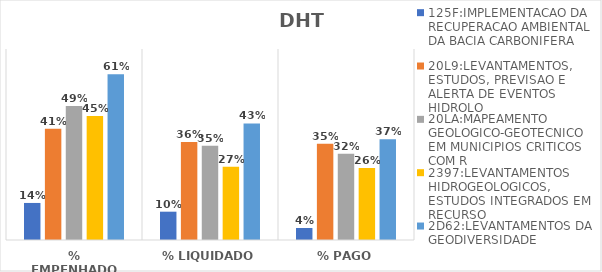
| Category | 125F:IMPLEMENTACAO DA RECUPERACAO AMBIENTAL DA BACIA CARBONIFERA | 20L9:LEVANTAMENTOS, ESTUDOS, PREVISAO E ALERTA DE EVENTOS HIDROLO | 20LA:MAPEAMENTO GEOLOGICO-GEOTECNICO EM MUNICIPIOS CRITICOS COM R | 2397:LEVANTAMENTOS HIDROGEOLOGICOS, ESTUDOS INTEGRADOS EM RECURSO | 2D62:LEVANTAMENTOS DA GEODIVERSIDADE |
|---|---|---|---|---|---|
| % EMPENHADO | 0.136 | 0.408 | 0.491 | 0.454 | 0.607 |
| % LIQUIDADO | 0.104 | 0.359 | 0.345 | 0.268 | 0.427 |
| % PAGO | 0.044 | 0.353 | 0.316 | 0.264 | 0.369 |